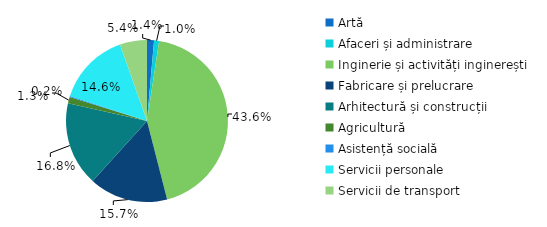
| Category | Series 0 |
|---|---|
| Artă | 1.4 |
| Afaceri și administrare | 1 |
| Inginerie și activități inginerești | 43.6 |
| Fabricare și prelucrare | 15.7 |
| Arhitectură și construcții | 16.8 |
| Agricultură | 1.3 |
| Asistență socială | 0.2 |
| Servicii personale | 14.6 |
| Servicii de transport | 5.4 |